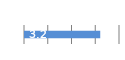
| Category | Series 0 |
|---|---|
| 0 | 3.21 |